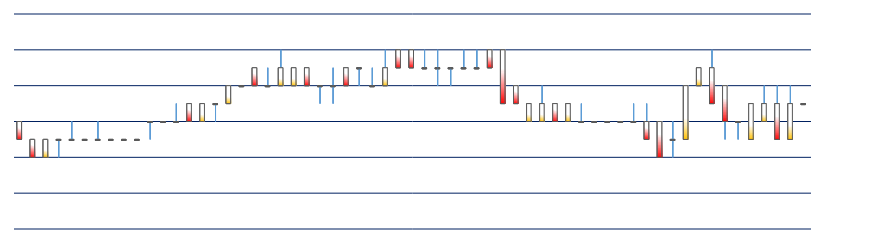
| Category | Series 0 | Series 1 | Series 2 | Series 3 |
|---|---|---|---|---|
| 2018-03-08 15:30:00 | 2739.25 | 2739.25 | 2739.25 | 2739.25 |
| 2018-03-08 15:14:55 | 2738.75 | 2739.5 | 2738.75 | 2739.25 |
| 2018-03-08 15:14:50 | 2739.25 | 2739.5 | 2738.75 | 2738.75 |
| 2018-03-08 15:14:45 | 2739 | 2739.5 | 2739 | 2739.25 |
| 2018-03-08 15:14:40 | 2738.75 | 2739.25 | 2738.75 | 2739.25 |
| 2018-03-08 15:14:35 | 2739 | 2739 | 2738.75 | 2739 |
| 2018-03-08 15:14:30 | 2739.5 | 2739.5 | 2738.75 | 2739 |
| 2018-03-08 15:14:25 | 2739.75 | 2740 | 2739.25 | 2739.25 |
| 2018-03-08 15:14:20 | 2739.5 | 2739.75 | 2739.5 | 2739.75 |
| 2018-03-08 15:14:15 | 2738.75 | 2739.5 | 2738.75 | 2739.5 |
| 2018-03-08 15:14:10 | 2738.75 | 2739 | 2738.5 | 2738.75 |
| 2018-03-08 15:14:05 | 2739 | 2739 | 2738.5 | 2738.5 |
| 2018-03-08 15:14:00 | 2739 | 2739.25 | 2738.75 | 2738.75 |
| 2018-03-08 15:13:55 | 2739 | 2739.25 | 2739 | 2739 |
| 2018-03-08 15:13:50 | 2739 | 2739 | 2739 | 2739 |
| 2018-03-08 15:13:45 | 2739 | 2739 | 2739 | 2739 |
| 2018-03-08 15:13:40 | 2739 | 2739 | 2739 | 2739 |
| 2018-03-08 15:13:35 | 2739 | 2739.25 | 2739 | 2739 |
| 2018-03-08 15:13:30 | 2739 | 2739.25 | 2739 | 2739.25 |
| 2018-03-08 15:13:25 | 2739.25 | 2739.25 | 2739 | 2739 |
| 2018-03-08 15:13:20 | 2739 | 2739.5 | 2739 | 2739.25 |
| 2018-03-08 15:13:15 | 2739 | 2739.25 | 2739 | 2739.25 |
| 2018-03-08 15:13:10 | 2739.5 | 2739.5 | 2739.25 | 2739.25 |
| 2018-03-08 15:13:05 | 2740 | 2740 | 2739.25 | 2739.25 |
| 2018-03-08 15:13:00 | 2740 | 2740 | 2739.75 | 2739.75 |
| 2018-03-08 15:12:55 | 2739.75 | 2740 | 2739.75 | 2739.75 |
| 2018-03-08 15:12:50 | 2739.75 | 2740 | 2739.75 | 2739.75 |
| 2018-03-08 15:12:45 | 2739.75 | 2739.75 | 2739.5 | 2739.75 |
| 2018-03-08 15:12:40 | 2739.75 | 2740 | 2739.5 | 2739.75 |
| 2018-03-08 15:12:35 | 2739.75 | 2740 | 2739.75 | 2739.75 |
| 2018-03-08 15:12:30 | 2740 | 2740 | 2739.75 | 2739.75 |
| 2018-03-08 15:12:25 | 2740 | 2740 | 2739.75 | 2739.75 |
| 2018-03-08 15:12:20 | 2739.5 | 2740 | 2739.5 | 2739.75 |
| 2018-03-08 15:12:15 | 2739.5 | 2739.75 | 2739.5 | 2739.5 |
| 2018-03-08 15:12:10 | 2739.75 | 2739.75 | 2739.5 | 2739.75 |
| 2018-03-08 15:12:05 | 2739.75 | 2739.75 | 2739.5 | 2739.5 |
| 2018-03-08 15:12:00 | 2739.5 | 2739.75 | 2739.25 | 2739.5 |
| 2018-03-08 15:11:55 | 2739.5 | 2739.5 | 2739.25 | 2739.5 |
| 2018-03-08 15:11:50 | 2739.75 | 2739.75 | 2739.5 | 2739.5 |
| 2018-03-08 15:11:45 | 2739.5 | 2739.75 | 2739.5 | 2739.75 |
| 2018-03-08 15:11:40 | 2739.5 | 2740 | 2739.5 | 2739.75 |
| 2018-03-08 15:11:35 | 2739.5 | 2739.75 | 2739.5 | 2739.5 |
| 2018-03-08 15:11:30 | 2739.75 | 2739.75 | 2739.5 | 2739.5 |
| 2018-03-08 15:11:25 | 2739.5 | 2739.5 | 2739.5 | 2739.5 |
| 2018-03-08 15:11:20 | 2739.25 | 2739.5 | 2739.25 | 2739.5 |
| 2018-03-08 15:11:15 | 2739.25 | 2739.25 | 2739 | 2739.25 |
| 2018-03-08 15:11:10 | 2739 | 2739.25 | 2739 | 2739.25 |
| 2018-03-08 15:11:05 | 2739.25 | 2739.25 | 2739 | 2739 |
| 2018-03-08 15:11:00 | 2739 | 2739.25 | 2739 | 2739 |
| 2018-03-08 15:10:55 | 2739 | 2739 | 2739 | 2739 |
| 2018-03-08 15:10:50 | 2739 | 2739 | 2738.75 | 2739 |
| 2018-03-08 15:10:45 | 2738.75 | 2738.75 | 2738.75 | 2738.75 |
| 2018-03-08 15:10:40 | 2738.75 | 2738.75 | 2738.75 | 2738.75 |
| 2018-03-08 15:10:35 | 2738.75 | 2738.75 | 2738.75 | 2738.75 |
| 2018-03-08 15:10:30 | 2738.75 | 2739 | 2738.75 | 2738.75 |
| 2018-03-08 15:10:25 | 2738.75 | 2738.75 | 2738.75 | 2738.75 |
| 2018-03-08 15:10:20 | 2738.75 | 2739 | 2738.75 | 2738.75 |
| 2018-03-08 15:10:15 | 2738.75 | 2738.75 | 2738.5 | 2738.75 |
| 2018-03-08 15:10:10 | 2738.5 | 2738.75 | 2738.5 | 2738.75 |
| 2018-03-08 15:10:05 | 2738.75 | 2738.75 | 2738.5 | 2738.5 |
| 2018-03-08 15:10:00 | 2739 | 2739 | 2738.75 | 2738.75 |